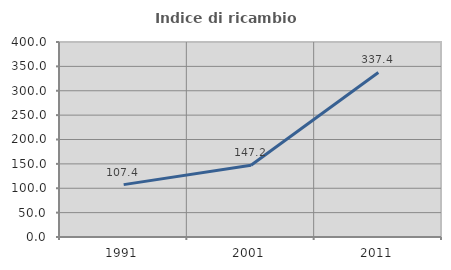
| Category | Indice di ricambio occupazionale  |
|---|---|
| 1991.0 | 107.423 |
| 2001.0 | 147.212 |
| 2011.0 | 337.444 |